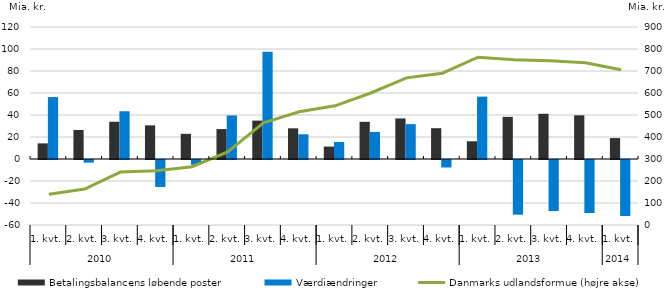
| Category | Betalingsbalancens løbende poster | Værdiændringer |
|---|---|---|
| 0 | 14.2 | 56.3 |
| 1 | 26.4 | -2.4 |
| 2 | 33.9 | 43.4 |
| 3 | 30.6 | -24.5 |
| 4 | 22.9 | -4.4 |
| 5 | 27.2 | 39.6 |
| 6 | 34.9 | 97.6 |
| 7 | 27.9 | 22.5 |
| 8 | 11.3 | 15.5 |
| 9 | 33.8 | 24.6 |
| 10 | 36.9 | 31.7 |
| 11 | 28 | -6.8 |
| 12 | 16.1 | 56.7 |
| 13 | 38.3 | -49.7 |
| 14 | 41.1 | -46.4 |
| 15 | 39.7 | -48.2 |
| 16 | 19 | -50.9 |